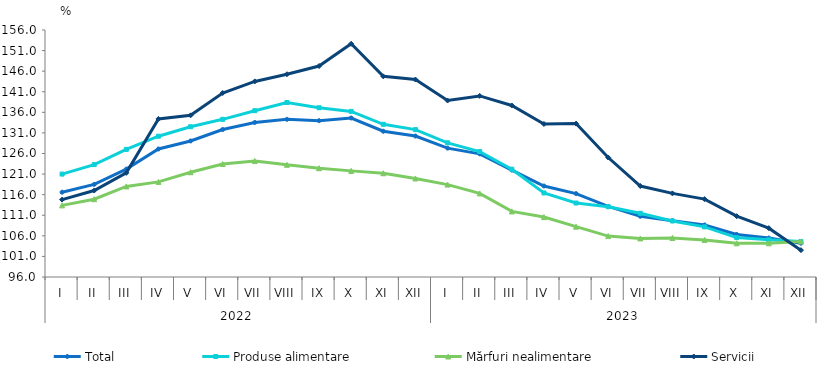
| Category | Total  | Produse alimentare | Mărfuri nealimentare  | Servicii |
|---|---|---|---|---|
| 0 | 116.6 | 121 | 113.4 | 114.8 |
| 1 | 118.5 | 123.3 | 114.9 | 117 |
| 2 | 122.2 | 127 | 118 | 121.3 |
| 3 | 127.1 | 130.2 | 119.1 | 134.4 |
| 4 | 129.047 | 132.5 | 121.45 | 135.267 |
| 5 | 131.827 | 134.301 | 123.443 | 140.701 |
| 6 | 133.547 | 136.399 | 124.168 | 143.511 |
| 7 | 134.294 | 138.387 | 123.256 | 145.253 |
| 8 | 133.971 | 137.121 | 122.424 | 147.248 |
| 9 | 134.625 | 136.226 | 121.779 | 152.646 |
| 10 | 131.406 | 133.093 | 121.201 | 144.742 |
| 11 | 130.241 | 131.801 | 119.936 | 143.965 |
| 12 | 127.307 | 128.59 | 118.441 | 138.865 |
| 13 | 125.91 | 126.47 | 116.31 | 139.99 |
| 14 | 121.977 | 122.19 | 111.932 | 137.666 |
| 15 | 118.102 | 116.414 | 110.554 | 133.178 |
| 16 | 116.262 | 113.97 | 108.228 | 133.268 |
| 17 | 113.152 | 113.076 | 105.931 | 125.017 |
| 18 | 110.755 | 111.48 | 105.365 | 118.101 |
| 19 | 109.689 | 109.605 | 105.486 | 116.313 |
| 20 | 108.634 | 108.179 | 105.004 | 114.916 |
| 21 | 106.342 | 105.575 | 104.182 | 110.77 |
| 22 | 105.453 | 105.022 | 104.182 | 107.863 |
| 23 | 104.199 | 104.62 | 104.612 | 102.522 |